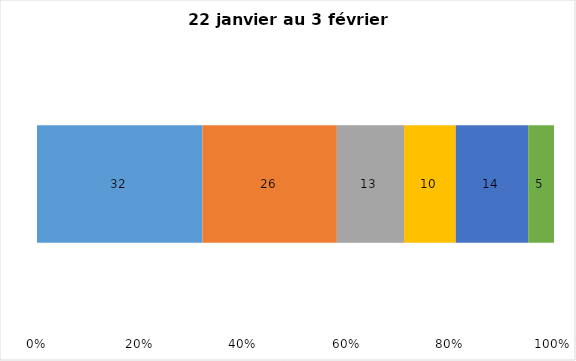
| Category | Plusieurs fois par jour | Une fois par jour | Quelques fois par semaine   | Une fois par semaine ou moins   |  Jamais   |  Je n’utilise pas les médias sociaux |
|---|---|---|---|---|---|---|
| 0 | 32 | 26 | 13 | 10 | 14 | 5 |